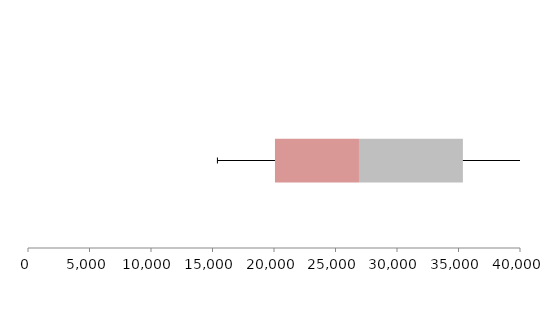
| Category | Series 1 | Series 2 | Series 3 |
|---|---|---|---|
| 0 | 20078.242 | 6829.318 | 8450.004 |